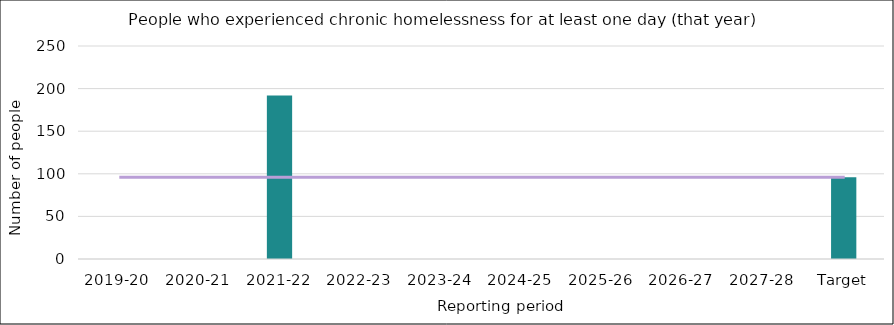
| Category | Series 0 |
|---|---|
| 2019-20 | 0 |
| 2020-21 | 0 |
| 2021-22 | 192 |
| 2022-23 | 0 |
| 2023-24 | 0 |
| 2024-25 | 0 |
| 2025-26 | 0 |
| 2026-27 | 0 |
| 2027-28 | 0 |
| Target | 96 |